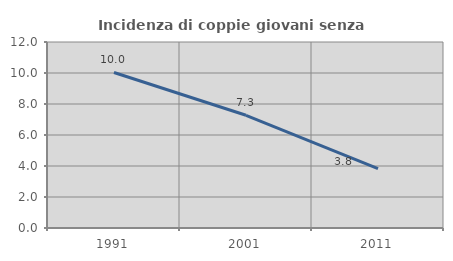
| Category | Incidenza di coppie giovani senza figli |
|---|---|
| 1991.0 | 10.032 |
| 2001.0 | 7.273 |
| 2011.0 | 3.835 |